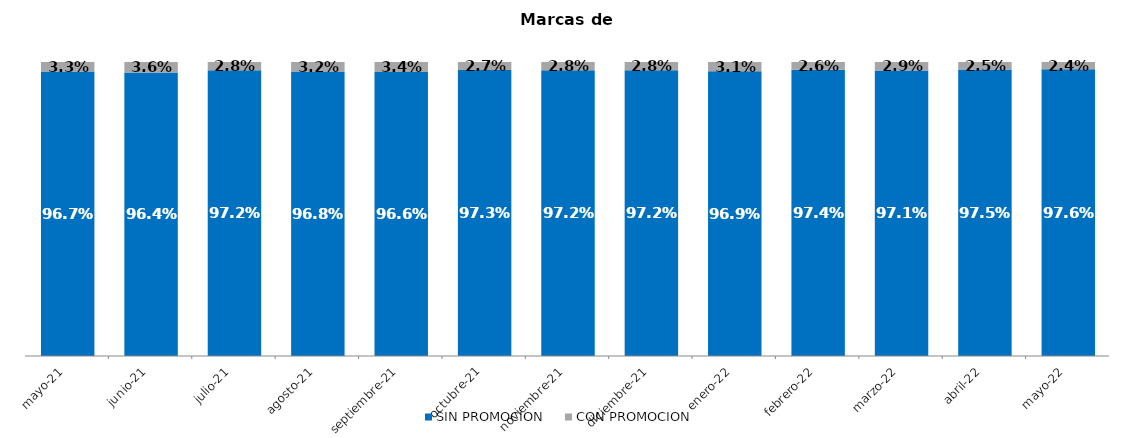
| Category | SIN PROMOCION   | CON PROMOCION   |
|---|---|---|
| 2021-05-01 | 0.967 | 0.033 |
| 2021-06-01 | 0.964 | 0.036 |
| 2021-07-01 | 0.972 | 0.028 |
| 2021-08-01 | 0.968 | 0.032 |
| 2021-09-01 | 0.966 | 0.034 |
| 2021-10-01 | 0.973 | 0.027 |
| 2021-11-01 | 0.972 | 0.028 |
| 2021-12-01 | 0.972 | 0.028 |
| 2022-01-01 | 0.969 | 0.031 |
| 2022-02-01 | 0.974 | 0.026 |
| 2022-03-01 | 0.971 | 0.029 |
| 2022-04-01 | 0.975 | 0.025 |
| 2022-05-01 | 0.976 | 0.024 |